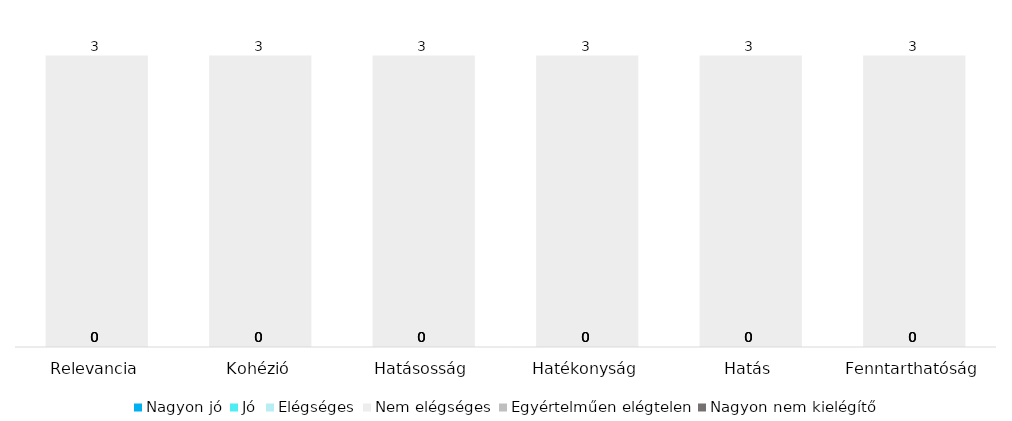
| Category | Nagyon jó | Jó | Elégséges | Nem elégséges | Egyértelműen elégtelen | Nagyon nem kielégítő |
|---|---|---|---|---|---|---|
| Relevancia | 0 | 0 | 0 | 3 | 0 | 0 |
| Kohézió | 0 | 0 | 0 | 3 | 0 | 0 |
| Hatásosság | 0 | 0 | 0 | 3 | 0 | 0 |
| Hatékonyság | 0 | 0 | 0 | 3 | 0 | 0 |
| Hatás | 0 | 0 | 0 | 3 | 0 | 0 |
| Fenntarthatóság | 0 | 0 | 0 | 3 | 0 | 0 |